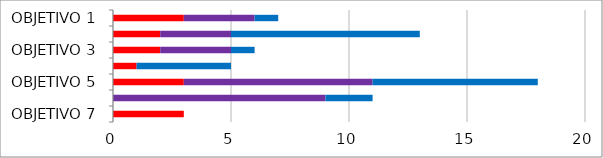
| Category | Series 0 | Series 1 | Series 2 |
|---|---|---|---|
| OBJETIVO 1 | 3 | 3 | 1 |
| OBJETIVO 2 | 2 | 3 | 8 |
| OBJETIVO 3 | 2 | 3 | 1 |
| OBJETIVO 4 | 1 | 0 | 4 |
| OBJETIVO 5 | 3 | 8 | 7 |
| OBJETIVO 6 | 0 | 9 | 2 |
| OBJETIVO 7 | 3 | 0 | 0 |